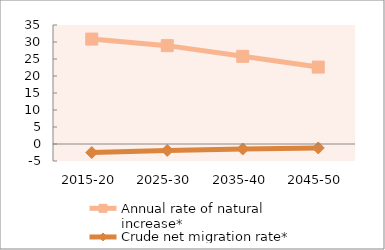
| Category | Annual rate of natural increase* | Crude net migration rate* |
|---|---|---|
| 2015-20 | 30.861 | -2.506 |
| 2025-30 | 28.931 | -1.897 |
| 2035-40 | 25.786 | -1.467 |
| 2045-50 | 22.624 | -1.167 |